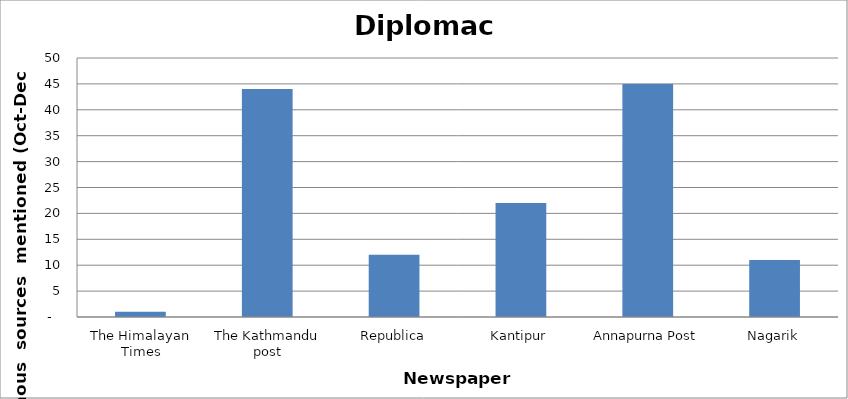
| Category | Diplomacy |
|---|---|
| The Himalayan Times | 1 |
| The Kathmandu post | 44 |
| Republica | 12 |
| Kantipur | 22 |
| Annapurna Post | 45 |
| Nagarik | 11 |